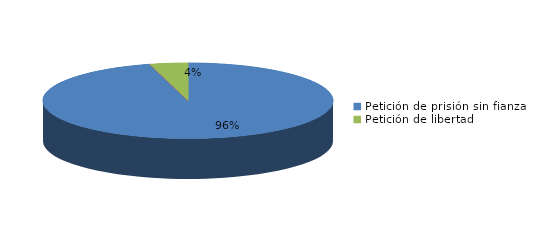
| Category | Series 0 |
|---|---|
| Petición de prisión sin fianza | 180 |
| Peticion de libertad con fianza | 0 |
| Petición de libertad | 8 |